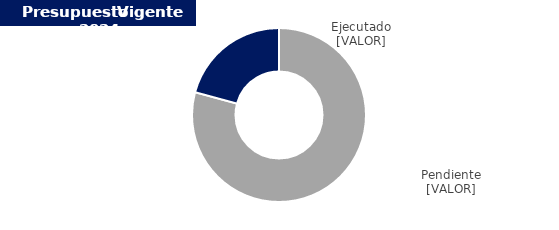
| Category | Series 0 |
|---|---|
| 0 | 5849311566.01 |
| 1 | 1534169433.99 |